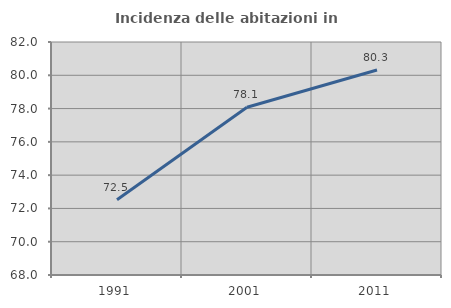
| Category | Incidenza delle abitazioni in proprietà  |
|---|---|
| 1991.0 | 72.524 |
| 2001.0 | 78.083 |
| 2011.0 | 80.319 |